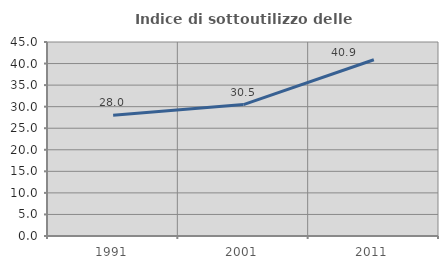
| Category | Indice di sottoutilizzo delle abitazioni  |
|---|---|
| 1991.0 | 28.015 |
| 2001.0 | 30.485 |
| 2011.0 | 40.882 |